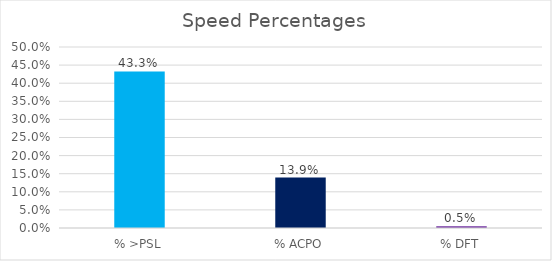
| Category | Series 0 |
|---|---|
| % >PSL | 0.433 |
| % ACPO | 0.139 |
| % DFT | 0.005 |